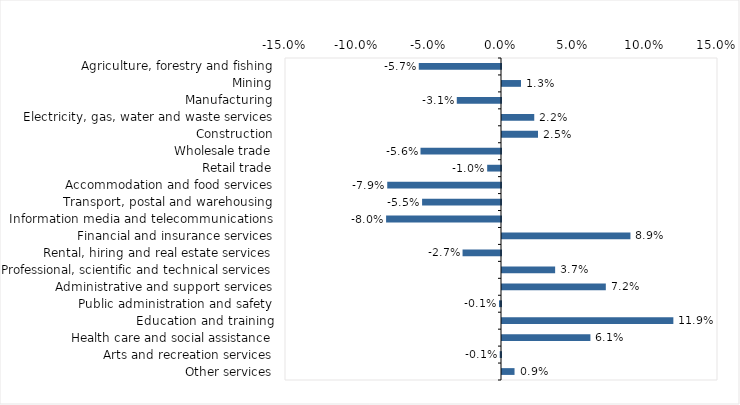
| Category | This week |
|---|---|
| Agriculture, forestry and fishing | -0.057 |
| Mining | 0.013 |
| Manufacturing | -0.031 |
| Electricity, gas, water and waste services | 0.022 |
| Construction | 0.025 |
| Wholesale trade | -0.056 |
| Retail trade | -0.01 |
| Accommodation and food services | -0.079 |
| Transport, postal and warehousing | -0.055 |
| Information media and telecommunications | -0.08 |
| Financial and insurance services | 0.089 |
| Rental, hiring and real estate services | -0.027 |
| Professional, scientific and technical services | 0.037 |
| Administrative and support services | 0.072 |
| Public administration and safety | -0.001 |
| Education and training | 0.119 |
| Health care and social assistance | 0.061 |
| Arts and recreation services | -0.001 |
| Other services | 0.009 |